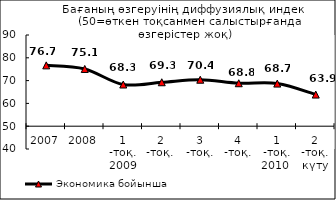
| Category | Экономика бойынша |
|---|---|
| 2007 | 76.681 |
| 2008 | 75.104 |
| 1 -тоқ. 2009 | 68.28 |
| 2 -тоқ.  | 69.275 |
| 3 -тоқ. | 70.385 |
| 4 -тоқ. | 68.84 |
| 1 -тоқ. 2010  | 68.69 |
| 2 -тоқ. күту | 63.87 |